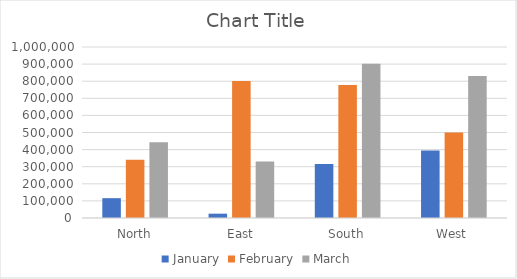
| Category | January | February | March |
|---|---|---|---|
| North | 115943 | 340439 | 442846 |
| East | 25304 | 800648 | 330504 |
| South | 315415 | 777825 | 902132 |
| West | 395459 | 500308 | 831089 |